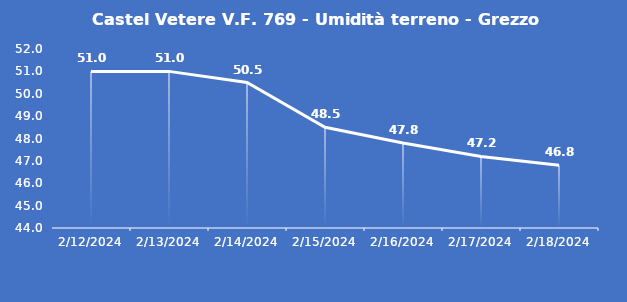
| Category | Castel Vetere V.F. 769 - Umidità terreno - Grezzo (%VWC) |
|---|---|
| 2/12/24 | 51 |
| 2/13/24 | 51 |
| 2/14/24 | 50.5 |
| 2/15/24 | 48.5 |
| 2/16/24 | 47.8 |
| 2/17/24 | 47.2 |
| 2/18/24 | 46.8 |